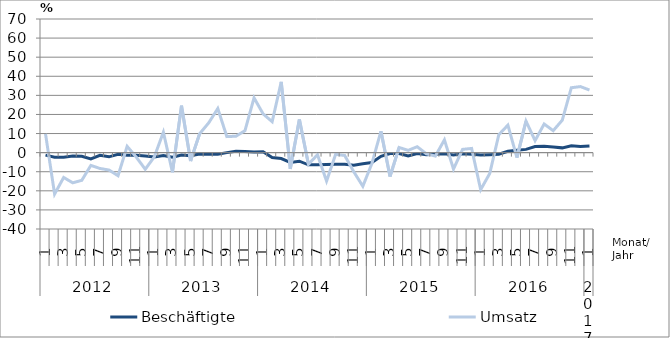
| Category | Beschäftigte | Umsatz |
|---|---|---|
| 0 | -1.3 | 9.8 |
| 1 | -2.4 | -21.7 |
| 2 | -2.4 | -13 |
| 3 | -1.8 | -15.8 |
| 4 | -1.9 | -14.5 |
| 5 | -3.3 | -6.7 |
| 6 | -1.4 | -8.3 |
| 7 | -2.2 | -9.1 |
| 8 | -0.9 | -12.1 |
| 9 | -1.4 | 3.3 |
| 10 | -1.4 | -2.3 |
| 11 | -1.8 | -8.7 |
| 12 | -2.3 | -2.2 |
| 13 | -1.5 | 10.7 |
| 14 | -2.4 | -10.3 |
| 15 | -1.3 | 24.6 |
| 16 | -1.6 | -4.4 |
| 17 | -0.7 | 9.9 |
| 18 | -0.8 | 15.6 |
| 19 | -0.8 | 23.1 |
| 20 | 0 | 8.4 |
| 21 | 0.7 | 8.6 |
| 22 | 0.6 | 11.5 |
| 23 | 0.3 | 28.7 |
| 24 | 0.5 | 20.3 |
| 25 | -2.6 | 16.2 |
| 26 | -3.1 | 37.1 |
| 27 | -5.1 | -8.5 |
| 28 | -4.5 | 17.4 |
| 29 | -6.4 | -6.1 |
| 30 | -6.4 | -1.1 |
| 31 | -6.2 | -14.9 |
| 32 | -6.1 | -0.9 |
| 33 | -6.1 | -1.5 |
| 34 | -6.6 | -10 |
| 35 | -5.8 | -17.6 |
| 36 | -5.2 | -5.7 |
| 37 | -1.9 | 11.2 |
| 38 | -0.5 | -12.5 |
| 39 | -0.5 | 2.7 |
| 40 | -1.7 | 1.2 |
| 41 | -0.5 | 3.1 |
| 42 | -1.1 | -0.6 |
| 43 | -0.8 | -1.8 |
| 44 | -0.6 | 6.7 |
| 45 | -1.2 | -8.6 |
| 46 | -0.6 | 1.7 |
| 47 | -0.9 | 2.2 |
| 48 | -1.3 | -19.4 |
| 49 | -1.1 | -10.9 |
| 50 | -0.8 | 9.4 |
| 51 | 0.7 | 14.4 |
| 52 | 1.2 | -2.6 |
| 53 | 1.7 | 16.5 |
| 54 | 3.2 | 6.3 |
| 55 | 3.4 | 15 |
| 56 | 3 | 11.5 |
| 57 | 2.5 | 17 |
| 58 | 3.6 | 34 |
| 59 | 3.2 | 34.6 |
| 60 | 3.5 | 32.8 |